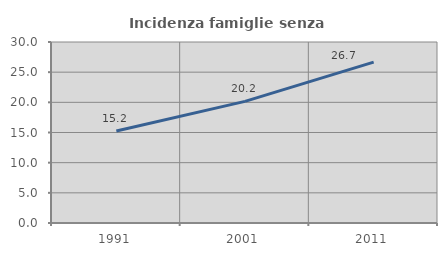
| Category | Incidenza famiglie senza nuclei |
|---|---|
| 1991.0 | 15.246 |
| 2001.0 | 20.155 |
| 2011.0 | 26.67 |